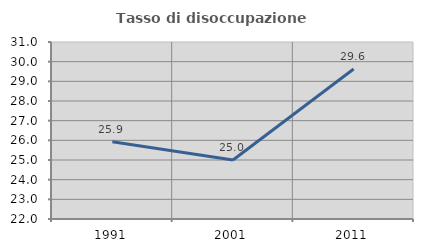
| Category | Tasso di disoccupazione giovanile  |
|---|---|
| 1991.0 | 25.926 |
| 2001.0 | 25 |
| 2011.0 | 29.63 |